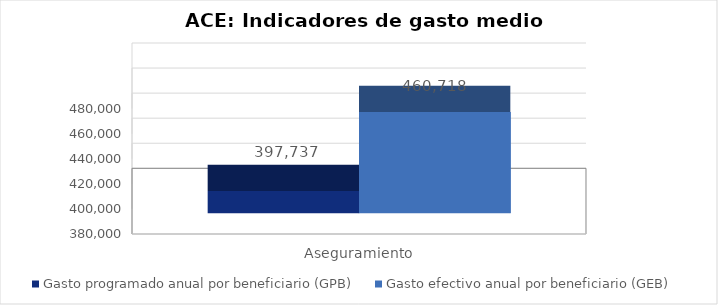
| Category | Gasto programado anual por beneficiario (GPB)  | Gasto efectivo anual por beneficiario (GEB)  |
|---|---|---|
| Aseguramiento | 397736.911 | 460718.335 |